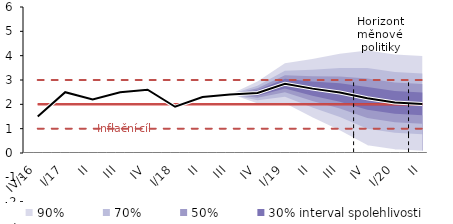
| Category | Inflation Target | Inflation Target - lower bound | Inflation Target - upper bound | linka | Střed předpovědi |
|---|---|---|---|---|---|
| IV/16 | 2 | 1 | 3 | 1.5 | 1.5 |
| I/17 | 2 | 1 | 3 | 2.5 | 2.5 |
| II | 2 | 1 | 3 | 2.2 | 2.2 |
| III | 2 | 1 | 3 | 2.5 | 2.5 |
| IV | 2 | 1 | 3 | 2.6 | 2.6 |
| I/18 | 2 | 1 | 3 | 1.9 | 1.9 |
| II | 2 | 1 | 3 | 2.3 | 2.3 |
| III | 2 | 1 | 3 | 2.4 | 2.4 |
| IV | 2 | 1 | 3 | 2.465 | 2.465 |
| I/19 | 2 | 1 | 3 | 2.847 | 2.847 |
| II | 2 | 1 | 3 | 2.645 | 2.645 |
| III | 2 | 1 | 3 | 2.487 | 2.487 |
| IV | 2 | 1 | 3 | 2.249 | 2.249 |
| I/20 | 2 | 1 | 3 | 2.078 | 2.078 |
| II | 2 | 1 | 3 | 2.018 | 2.018 |